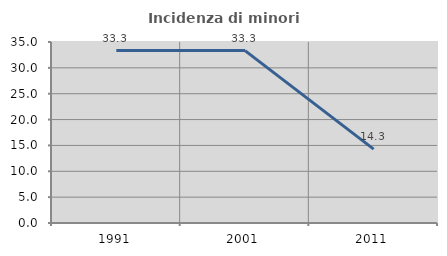
| Category | Incidenza di minori stranieri |
|---|---|
| 1991.0 | 33.333 |
| 2001.0 | 33.333 |
| 2011.0 | 14.286 |